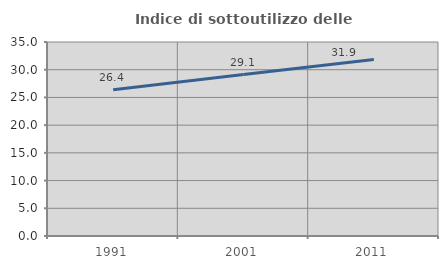
| Category | Indice di sottoutilizzo delle abitazioni  |
|---|---|
| 1991.0 | 26.38 |
| 2001.0 | 29.126 |
| 2011.0 | 31.858 |